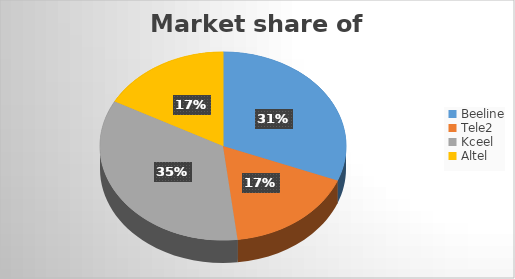
| Category | Series 0 |
|---|---|
| Beeline | 6150000 |
| Tele2 | 3400000 |
| Kceel | 6900000 |
| Altel | 3400000 |